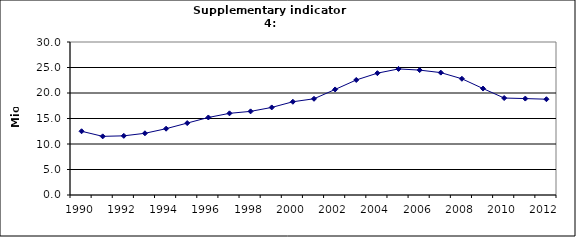
| Category | Domestic air-passengers, Mio |
|---|---|
| 1990 | 12.5 |
| 1991 | 11.5 |
| 1992 | 11.6 |
| 1993 | 12.1 |
| 1994 | 13 |
| 1995 | 14.1 |
| 1996 | 15.2 |
| 1997 | 16.013 |
| 1998 | 16.4 |
| 1999 | 17.17 |
| 2000 | 18.283 |
| 2001 | 18.867 |
| 2002 | 20.696 |
| 2003 | 22.553 |
| 2004 | 23.89 |
| 2005 | 24.719 |
| 2006 | 24.491 |
| 2007 | 23.997 |
| 2008 | 22.789 |
| 2009 | 20.87 |
| 2010 | 19.011 |
| 2011 | 18.909 |
| 2012 | 18.784 |